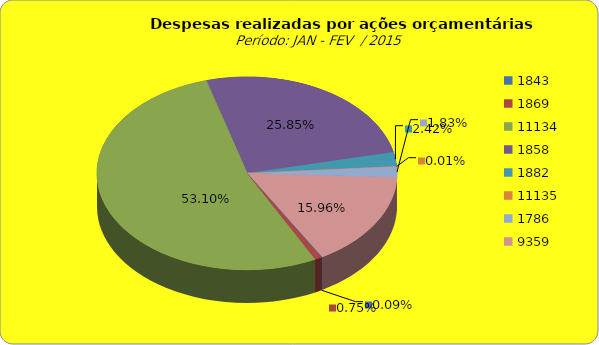
| Category | Series 1 |
|---|---|
| 1843.0 | 40000 |
| 1869.0 | 338247.76 |
| 11134.0 | 23992398.2 |
| 1858.0 | 11677295.58 |
| 1882.0 | 1091470.64 |
| 11135.0 | 3749 |
| 1786.0 | 825231.95 |
| 9359.0 | 7212957.06 |